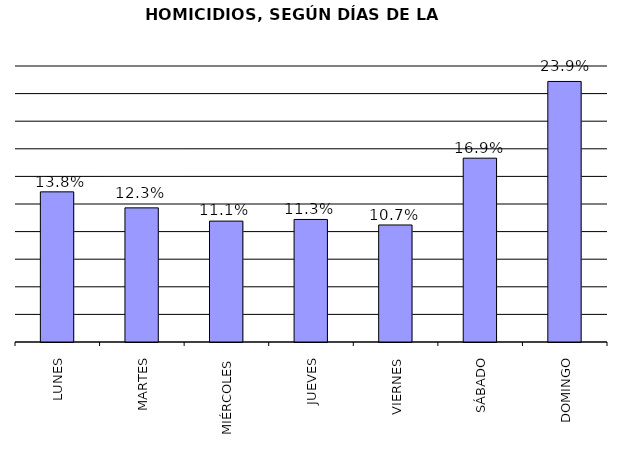
| Category | Series 0 |
|---|---|
| LUNES | 272 |
| MARTES | 243 |
| MIÉRCOLES | 219 |
| JUEVES | 222 |
| VIERNES | 212 |
| SÁBADO | 333 |
| DOMINGO | 472 |